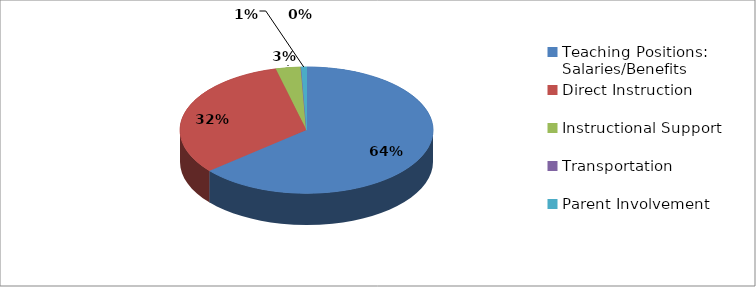
| Category | Series 0 |
|---|---|
| Teaching Positions: Salaries/Benefits       | 611272 |
| Direct Instruction  | 308575 |
| Instructional Support  | 30649 |
| Transportation | 0 |
| Parent Involvement | 6600 |